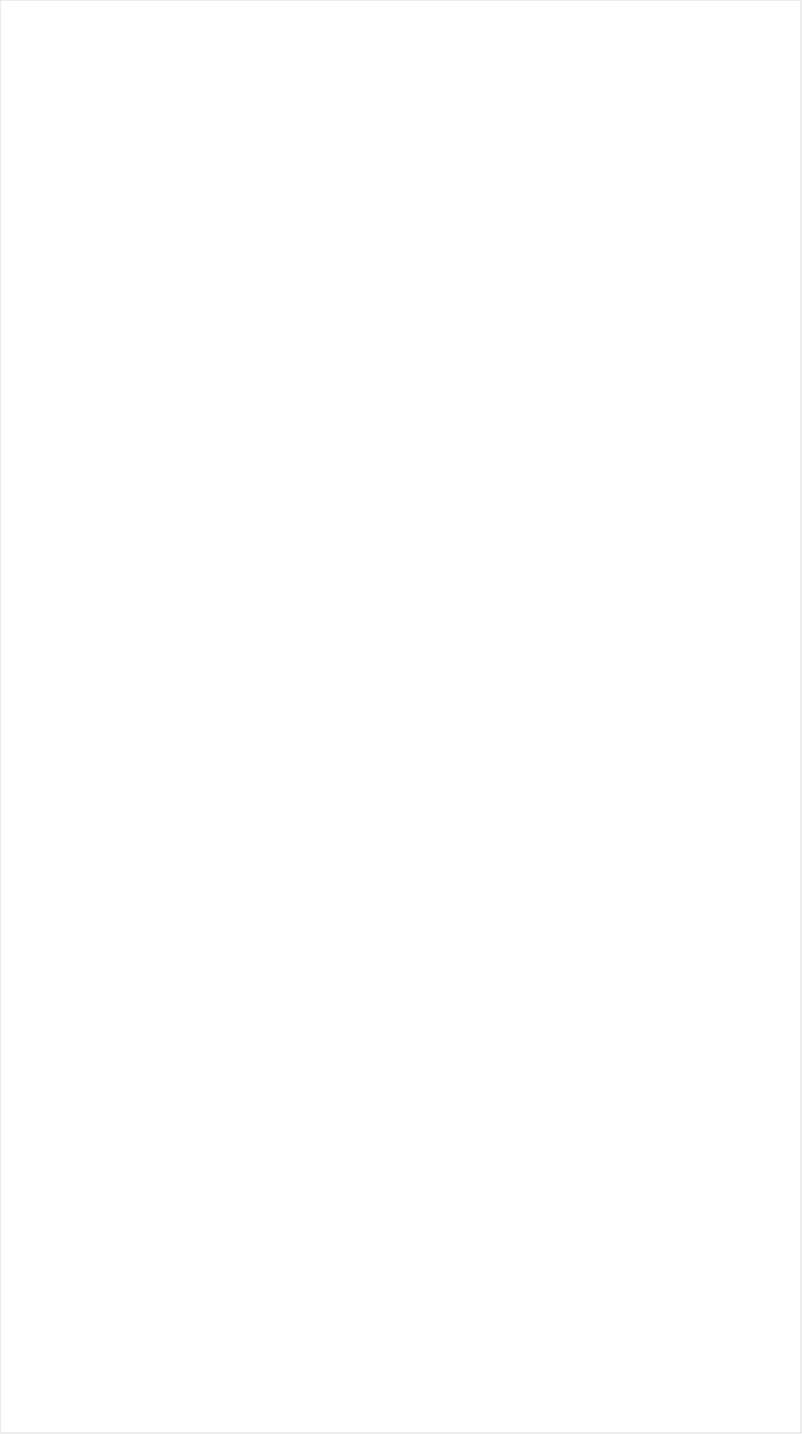
| Category | Total |
|---|---|
| Galavision | -0.93 |
| NBC Universo | -0.884 |
| UniMas | -0.877 |
| Telemundo | -0.853 |
| Univision | -0.836 |
| TUDN | -0.827 |
| VH1 | -0.659 |
| TV ONE | -0.653 |
| MTV2 | -0.634 |
| BET | -0.595 |
| BET Her | -0.567 |
| Adult Swim | -0.537 |
| Nick Toons | -0.534 |
| Lifetime Movies | -0.515 |
| Nick | -0.512 |
| Logo | -0.496 |
| Disney Channel | -0.479 |
| Disney XD | -0.455 |
| Nick Jr. | -0.455 |
| Teen Nick | -0.392 |
| WE TV | -0.376 |
| TLC | -0.363 |
| Nick@Nite | -0.351 |
| Investigation Discovery | -0.344 |
| Disney Junior US | -0.335 |
| Universal Kids | -0.332 |
| Discovery Life Channel | -0.33 |
| Oprah Winfrey Network | -0.327 |
| Travel | -0.302 |
| Lifetime | -0.295 |
| UP TV | -0.232 |
| OXYGEN | -0.226 |
| A&E | -0.224 |
| MTV | -0.22 |
| Discovery Family Channel | -0.204 |
| USA Network | -0.179 |
| truTV | -0.156 |
| FXX | -0.151 |
| Headline News | -0.15 |
| Science Channel | -0.147 |
| Hallmark | -0.146 |
| ION | -0.143 |
| POP | -0.103 |
| SYFY | -0.101 |
| Hallmark Movies & Mysteries | -0.097 |
| E! | -0.087 |
| Freeform | -0.073 |
| TBS | -0.069 |
| CMTV | -0.065 |
| Paramount Network | -0.049 |
| FX | -0.045 |
| INSP | -0.044 |
| FX Movie Channel | -0.011 |
| Great American Country | -0.004 |
| Reelz Channel | 0.002 |
| CW | 0.011 |
| Animal Planet | 0.013 |
| Motor Trend Network | 0.014 |
| TNT | 0.023 |
| Viceland | 0.024 |
| SundanceTV | 0.032 |
| CNN | 0.038 |
| TV LAND | 0.038 |
| BRAVO | 0.049 |
| MSNBC | 0.053 |
| Game Show | 0.055 |
| Discovery Channel | 0.061 |
| Comedy Central | 0.068 |
| AMC | 0.069 |
| FYI | 0.07 |
| National Geographic Wild | 0.083 |
| Food Network | 0.122 |
| NBA TV | 0.123 |
| Ovation | 0.127 |
| HGTV | 0.132 |
| History Channel | 0.139 |
| MyNetworkTV | 0.15 |
| Cooking Channel | 0.165 |
| BBC America | 0.183 |
| Weather Channel | 0.212 |
| National Geographic | 0.223 |
| American Heroes Channel | 0.23 |
| ABC | 0.244 |
| RFD TV | 0.249 |
| Independent Film (IFC) | 0.252 |
| FOX | 0.258 |
| WGN America | 0.305 |
| Destination America | 0.323 |
| DIY | 0.327 |
| Smithsonian | 0.364 |
| CNBC | 0.368 |
| NBC | 0.38 |
| Fox News | 0.422 |
| Outdoor Channel | 0.479 |
| PBS | 0.512 |
| FXDEP | 0.526 |
| NFL Network | 0.535 |
| Fox Business | 0.541 |
| CBS | 0.542 |
| The Sportsman Channel | 0.615 |
| Bloomberg HD | 0.734 |
| Fox Sports 1 | 0.776 |
| ESPNEWS | 0.803 |
| ESPN | 0.813 |
| ESPN Deportes | 0.848 |
| ESPN2 | 0.924 |
| NBC Sports | 0.942 |
| FOX Sports 2 | 1.042 |
| Olympic Channel | 1.068 |
| Tennis Channel | 1.086 |
| ESPNU | 1.116 |
| MLB Network | 1.121 |
| CBS Sports | 1.188 |
| PAC-12 Network | 1.256 |
| NHL | 1.285 |
| Big Ten Network | 1.319 |
| Golf | 5.772 |